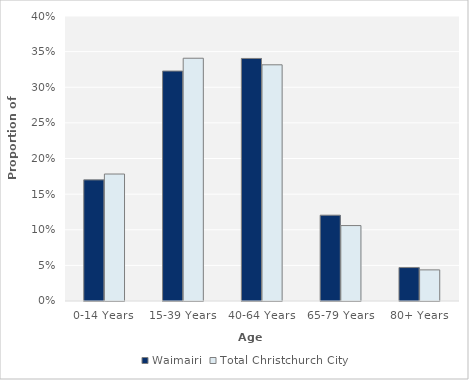
| Category | Waimairi | Total Christchurch City |
|---|---|---|
| 0-14 Years | 0.17 | 0.178 |
| 15-39 Years | 0.323 | 0.341 |
| 40-64 Years | 0.34 | 0.331 |
| 65-79 Years | 0.12 | 0.106 |
| 80+ Years | 0.047 | 0.044 |